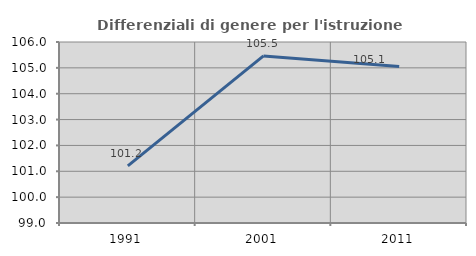
| Category | Differenziali di genere per l'istruzione superiore |
|---|---|
| 1991.0 | 101.207 |
| 2001.0 | 105.46 |
| 2011.0 | 105.055 |